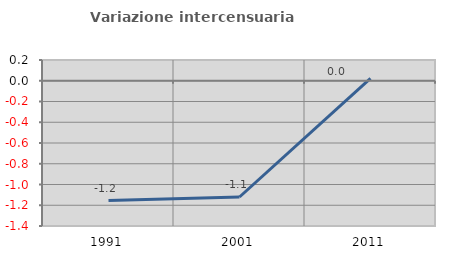
| Category | Variazione intercensuaria annua |
|---|---|
| 1991.0 | -1.155 |
| 2001.0 | -1.121 |
| 2011.0 | 0.023 |